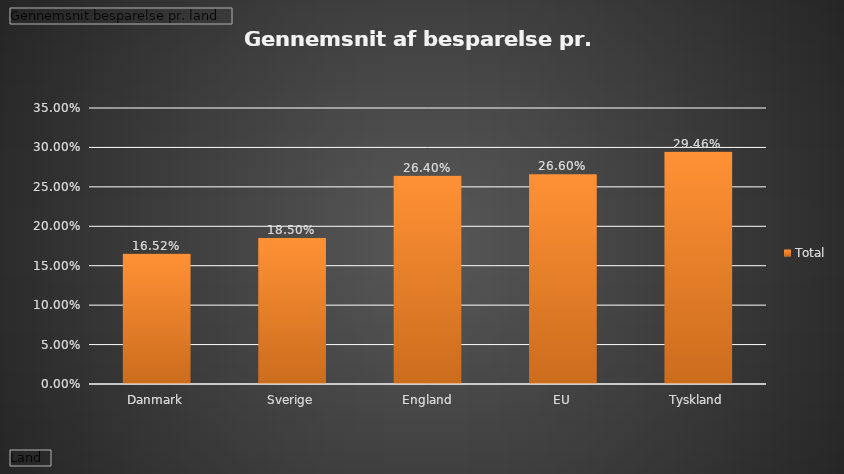
| Category | Total |
|---|---|
| Danmark | 0.165 |
| Sverige | 0.185 |
| England | 0.264 |
| EU | 0.266 |
| Tyskland | 0.295 |